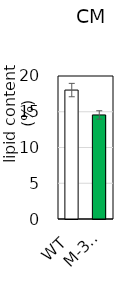
| Category | CM |
|---|---|
| 0 | 18.032 |
| 1 | 14.552 |